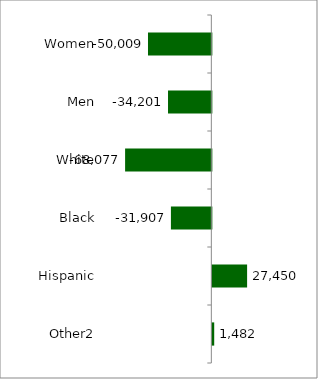
| Category | 50 states and D.C. |
|---|---|
| Women | -50009 |
| Men | -34201 |
| White | -68077 |
| Black | -31907 |
| Hispanic | 27450 |
| Other2 | 1482 |